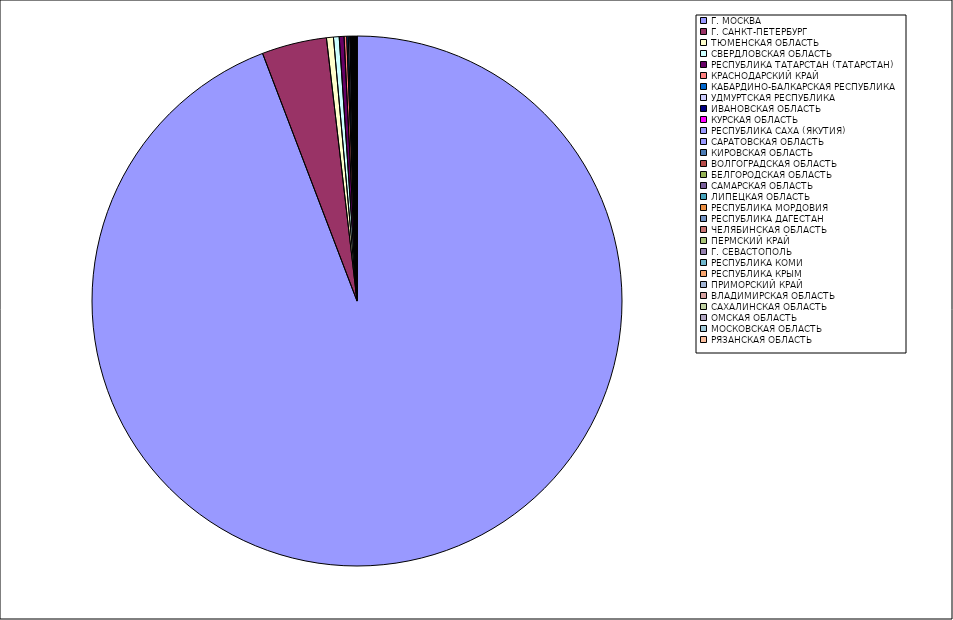
| Category | Оборот |
|---|---|
| Г. МОСКВА | 94.148 |
| Г. САНКТ-ПЕТЕРБУРГ | 3.955 |
| ТЮМЕНСКАЯ ОБЛАСТЬ | 0.422 |
| СВЕРДЛОВСКАЯ ОБЛАСТЬ | 0.348 |
| РЕСПУБЛИКА ТАТАРСТАН (ТАТАРСТАН) | 0.295 |
| КРАСНОДАРСКИЙ КРАЙ | 0.159 |
| КАБАРДИНО-БАЛКАРСКАЯ РЕСПУБЛИКА | 0.091 |
| УДМУРТСКАЯ РЕСПУБЛИКА | 0.09 |
| ИВАНОВСКАЯ ОБЛАСТЬ | 0.049 |
| КУРСКАЯ ОБЛАСТЬ | 0.041 |
| РЕСПУБЛИКА САХА (ЯКУТИЯ) | 0.037 |
| САРАТОВСКАЯ ОБЛАСТЬ | 0.036 |
| КИРОВСКАЯ ОБЛАСТЬ | 0.032 |
| ВОЛГОГРАДСКАЯ ОБЛАСТЬ | 0.027 |
| БЕЛГОРОДСКАЯ ОБЛАСТЬ | 0.025 |
| САМАРСКАЯ ОБЛАСТЬ | 0.023 |
| ЛИПЕЦКАЯ ОБЛАСТЬ | 0.019 |
| РЕСПУБЛИКА МОРДОВИЯ | 0.016 |
| РЕСПУБЛИКА ДАГЕСТАН | 0.016 |
| ЧЕЛЯБИНСКАЯ ОБЛАСТЬ | 0.015 |
| ПЕРМСКИЙ КРАЙ | 0.014 |
| Г. СЕВАСТОПОЛЬ | 0.014 |
| РЕСПУБЛИКА КОМИ | 0.013 |
| РЕСПУБЛИКА КРЫМ | 0.013 |
| ПРИМОРСКИЙ КРАЙ | 0.01 |
| ВЛАДИМИРСКАЯ ОБЛАСТЬ | 0.008 |
| САХАЛИНСКАЯ ОБЛАСТЬ | 0.008 |
| ОМСКАЯ ОБЛАСТЬ | 0.008 |
| МОСКОВСКАЯ ОБЛАСТЬ | 0.007 |
| РЯЗАНСКАЯ ОБЛАСТЬ | 0.007 |